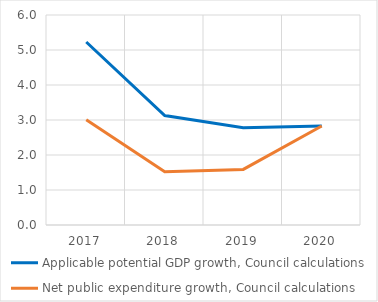
| Category | Applicable potential GDP growth, Council calculations | Net public expenditure growth, Council calculations |
|---|---|---|
| 2017.0 | 5.228 | 3.004 |
| 2018.0 | 3.127 | 1.524 |
| 2019.0 | 2.776 | 1.588 |
| 2020.0 | 2.83 | 2.83 |